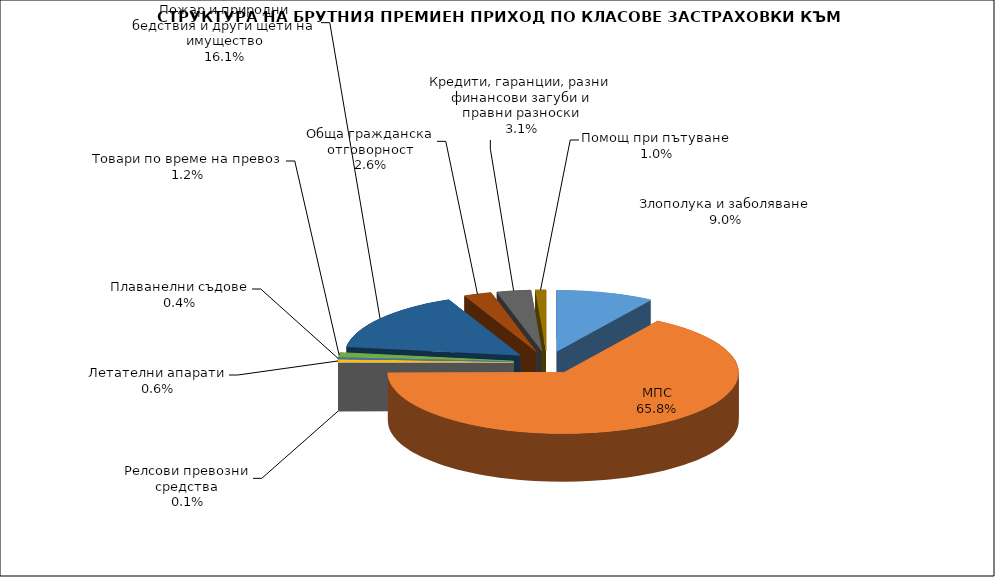
| Category | Злополука и заболяване МПС Релсови превозни средства Летателни апарати Плаванелни съдове Товари по време на превоз Пожар и природни бедствия и други щети на имущество Обща гражданска отговорност Кредити, гаранции, разни финансови загуби и правни разноски  |
|---|---|
| Злополука и заболяване | 0.09 |
| МПС | 0.658 |
| Релсови превозни средства | 0.001 |
| Летателни апарати | 0.006 |
| Плаванелни съдове | 0.004 |
| Товари по време на превоз | 0.012 |
| Пожар и природни бедствия и други щети на имущество | 0.161 |
| Обща гражданска отговорност | 0.026 |
| Кредити, гаранции, разни финансови загуби и правни разноски | 0.031 |
| Помощ при пътуване | 0.01 |